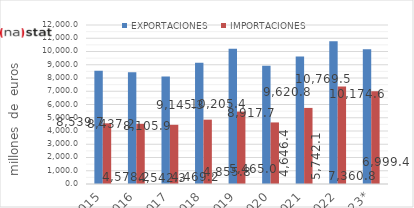
| Category | EXPORTACIONES | IMPORTACIONES |
|---|---|---|
| 2015 | 8539.71 | 4578.19 |
| 2016 | 8437.22 | 4542.31 |
| 2017 | 8105.93 | 4469.22 |
| 2018 | 9145.28 | 4855.78 |
| 2019 | 10205.37 | 5465 |
| 2020 | 8917.66 | 4646.41 |
| 2021 | 9620.78 | 5742.12 |
| 2022 | 10769.48 | 7360.82 |
| 2023* | 10174.63 | 6999.41 |